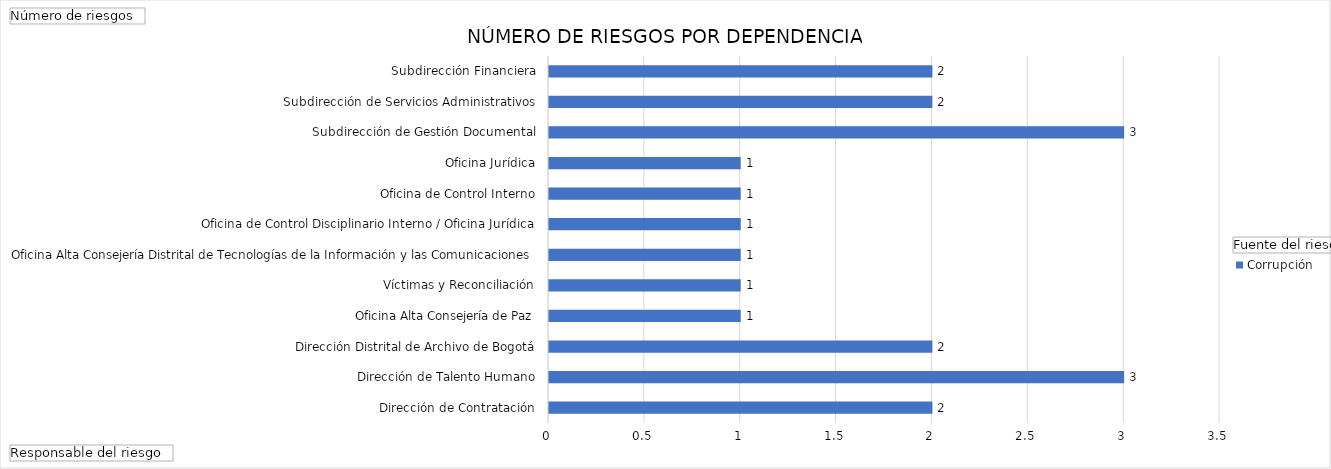
| Category | Corrupción |
|---|---|
| Dirección de Contratación | 2 |
| Dirección de Talento Humano | 3 |
| Dirección Distrital de Archivo de Bogotá | 2 |
| Oficina Alta Consejería de Paz, Víctimas y Reconciliación | 1 |
| Oficina Alta Consejería Distrital de Tecnologías de la Información y las Comunicaciones | 1 |
| Oficina de Control Disciplinario Interno / Oficina Jurídica | 1 |
| Oficina de Control Interno | 1 |
| Oficina Jurídica | 1 |
| Subdirección de Gestión Documental | 1 |
| Subdirección de Servicios Administrativos | 3 |
| Subdirección Financiera | 2 |
| Subsecretaría de Servicio a la Ciudadanía | 2 |